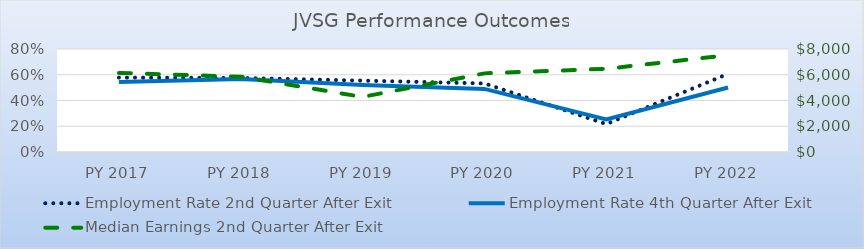
| Category | Employment Rate 2nd Quarter After Exit | Employment Rate 4th Quarter After Exit |
|---|---|---|
| PY 2017 | 0.578 | 0.543 |
| PY 2018 | 0.575 | 0.567 |
| PY 2019 | 0.554 | 0.52 |
| PY 2020 | 0.533 | 0.49 |
| PY 2021 | 0.217 | 0.253 |
| PY 2022 | 0.607 | 0.501 |